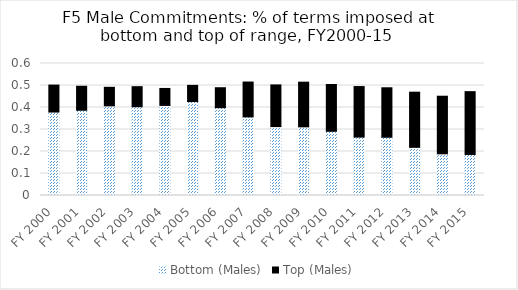
| Category | Bottom (Males) | Top (Males) |
|---|---|---|
| FY 2000 | 0.379 | 0.123 |
| FY 2001 | 0.388 | 0.109 |
| FY 2002 | 0.407 | 0.084 |
| FY 2003 | 0.404 | 0.091 |
| FY 2004 | 0.409 | 0.077 |
| FY 2005 | 0.427 | 0.074 |
| FY 2006 | 0.399 | 0.091 |
| FY 2007 | 0.357 | 0.158 |
| FY 2008 | 0.313 | 0.189 |
| FY 2009 | 0.312 | 0.203 |
| FY 2010 | 0.292 | 0.213 |
| FY 2011 | 0.265 | 0.23 |
| FY 2012 | 0.265 | 0.225 |
| FY 2013 | 0.219 | 0.251 |
| FY 2014 | 0.19 | 0.262 |
| FY 2015 | 0.187 | 0.286 |